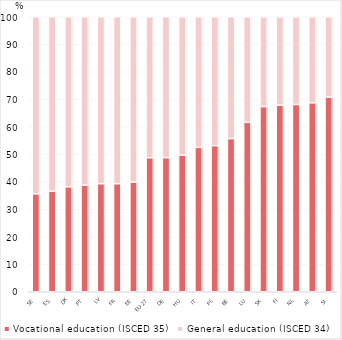
| Category | Vocational education (ISCED 35) | General education (ISCED 34) |
|---|---|---|
| SE | 35.603 | 64.397 |
| ES | 36.557 | 63.443 |
| DK | 38.168 | 61.832 |
| PT | 38.725 | 61.275 |
| LV | 39.275 | 60.725 |
| FR | 39.281 | 60.719 |
| EE | 39.879 | 60.121 |
| EU-27 | 48.743 | 51.257 |
| DE | 48.76 | 51.24 |
| HU | 49.656 | 50.344 |
| IT | 52.509 | 47.491 |
| PL | 53.136 | 46.864 |
| BE | 55.686 | 44.314 |
| LU | 61.607 | 38.393 |
| SK | 67.334 | 32.666 |
| FI | 67.837 | 32.163 |
| NL | 68.096 | 31.904 |
| AT | 68.708 | 31.292 |
| SI | 70.812 | 29.188 |